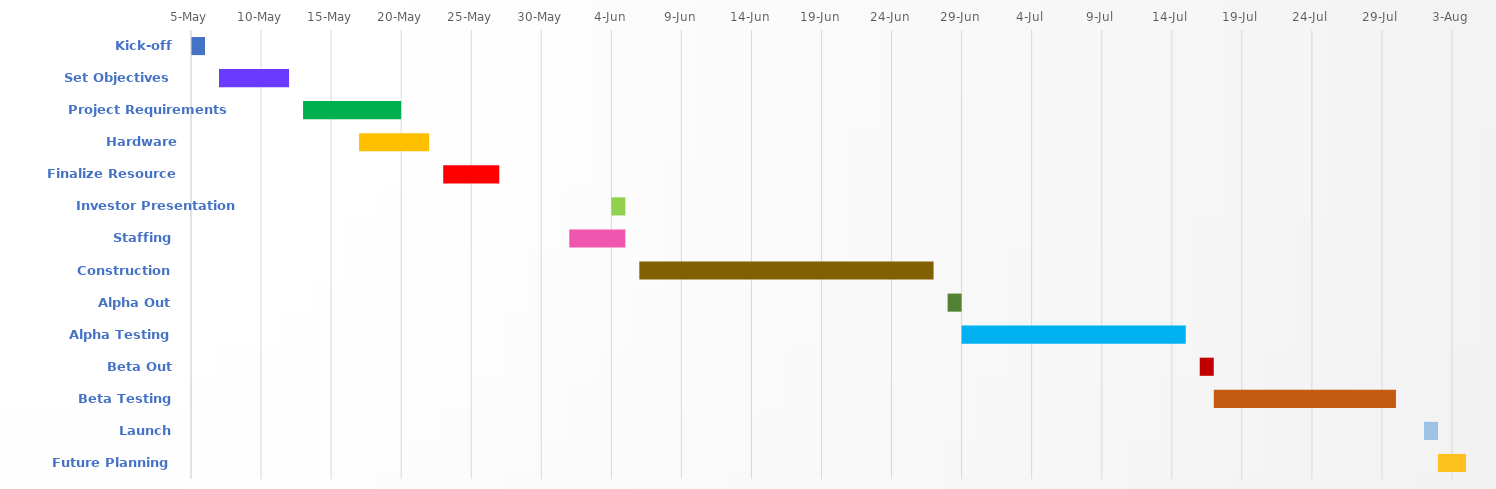
| Category | BEGIN | Duration |
|---|---|---|
| Kick-off | 2016-05-05 | 1 |
| Set Objectives | 2016-05-07 | 5 |
| Project Requirements | 2016-05-13 | 7 |
| Hardware Requirements | 2016-05-17 | 5 |
| Finalize Resource Plan | 2016-05-23 | 4 |
| Investor Presentation | 2016-06-04 | 1 |
| Staffing | 2016-06-01 | 4 |
| Construction | 2016-06-06 | 21 |
| Alpha Out | 2016-06-28 | 1 |
| Alpha Testing | 2016-06-29 | 16 |
| Beta Out | 2016-07-16 | 1 |
| Beta Testing | 2016-07-17 | 13 |
| Launch | 2016-08-01 | 1 |
| Future Planning | 2016-08-02 | 2 |